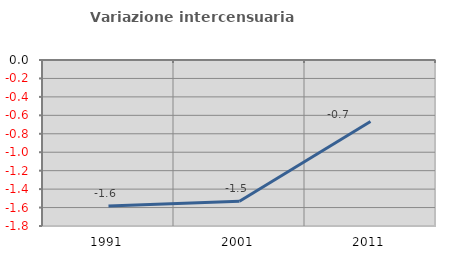
| Category | Variazione intercensuaria annua |
|---|---|
| 1991.0 | -1.583 |
| 2001.0 | -1.532 |
| 2011.0 | -0.666 |